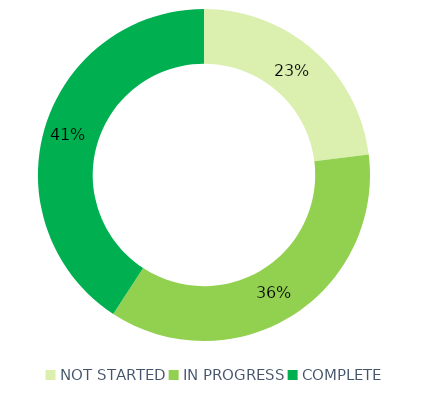
| Category | Series 0 |
|---|---|
| NOT STARTED | 35 |
| IN PROGRESS | 55 |
| COMPLETE | 62 |